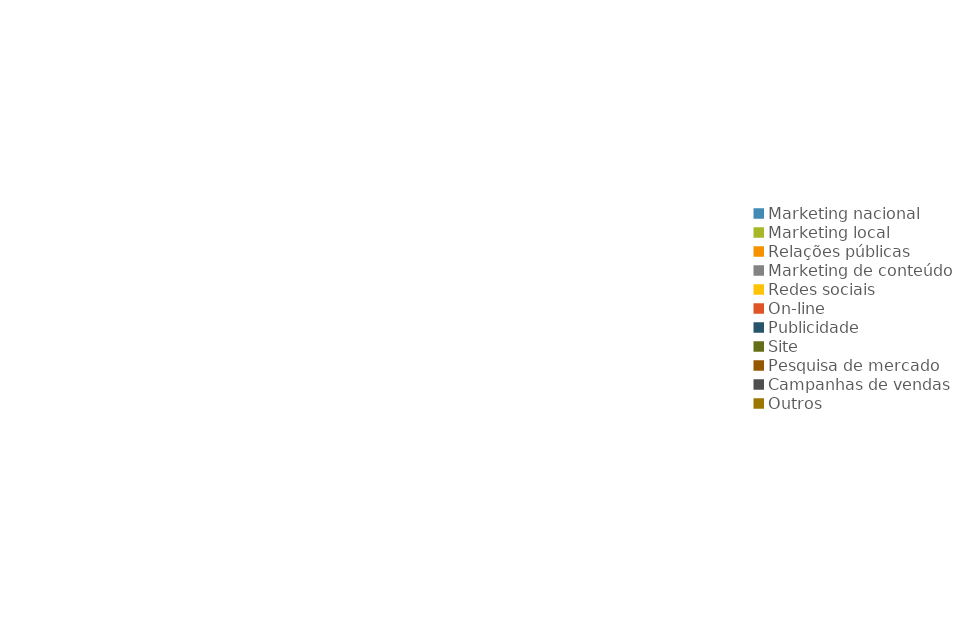
| Category | Series 0 | Series 1 |
|---|---|---|
| Marketing nacional | 0 | 0 |
| Marketing local | 0 | 0 |
| Relações públicas | 0 | 0 |
| Marketing de conteúdo | 0 | 0 |
| Redes sociais | 0 | 0 |
| On-line | 0 | 0 |
| Publicidade | 0 | 0 |
| Site | 0 | 0 |
| Pesquisa de mercado | 0 | 0 |
| Campanhas de vendas | 0 | 0 |
| Outros | 0 | 0 |